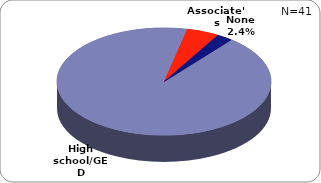
| Category | Series 0 |
|---|---|
| None | 0.024 |
| High school/GED | 0.927 |
| Associate's | 0.049 |